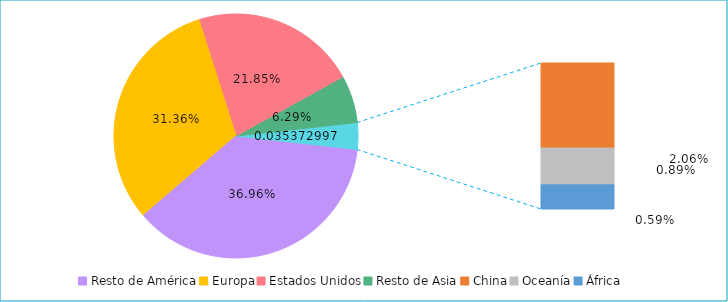
| Category | Series 0 |
|---|---|
| Resto de América | 0.37 |
| Europa | 0.314 |
| Estados Unidos | 0.219 |
| Resto de Asia | 0.063 |
| China | 0.021 |
| Oceanía | 0.009 |
| África | 0.006 |